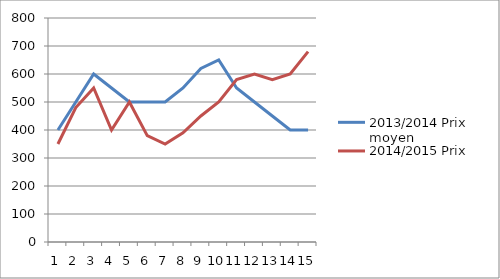
| Category | 2013/2014 Prix moyen | 2014/2015 Prix moyen |
|---|---|---|
| 0 | 400 | 350 |
| 1 | 500 | 480 |
| 2 | 600 | 550 |
| 3 | 550 | 400 |
| 4 | 500 | 500 |
| 5 | 500 | 380 |
| 6 | 500 | 350 |
| 7 | 550 | 390 |
| 8 | 620 | 450 |
| 9 | 650 | 500 |
| 10 | 550 | 580 |
| 11 | 500 | 600 |
| 12 | 450 | 580 |
| 13 | 400 | 600 |
| 14 | 400 | 680 |